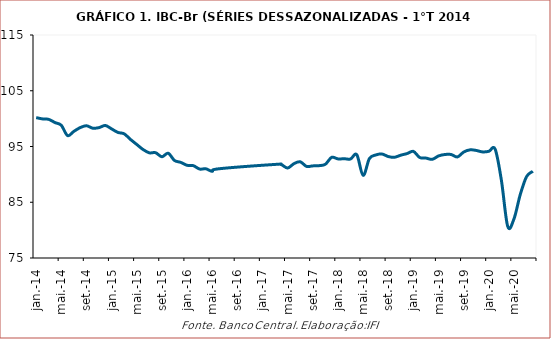
| Category | IBC-Br |
|---|---|
| 2014-01-01 | 100.182 |
| 2014-02-01 | 99.953 |
| 2014-03-01 | 99.865 |
| 2014-04-01 | 99.291 |
| 2014-05-01 | 98.804 |
| 2014-06-01 | 96.953 |
| 2014-07-01 | 97.717 |
| 2014-08-01 | 98.385 |
| 2014-09-01 | 98.723 |
| 2014-10-01 | 98.284 |
| 2014-11-01 | 98.385 |
| 2014-12-01 | 98.771 |
| 2015-01-01 | 98.156 |
| 2015-02-01 | 97.528 |
| 2015-03-01 | 97.278 |
| 2015-04-01 | 96.271 |
| 2015-05-01 | 95.366 |
| 2015-06-01 | 94.461 |
| 2015-07-01 | 93.866 |
| 2015-08-01 | 93.886 |
| 2015-09-01 | 93.157 |
| 2015-10-01 | 93.792 |
| 2015-11-01 | 92.495 |
| 2015-12-01 | 92.15 |
| 2016-01-01 | 91.63 |
| 2016-02-01 | 91.563 |
| 2016-03-01 | 90.955 |
| 2016-04-01 | 91.002 |
| 2016-05-01 | 90.549 |
| 2016-06-01 | 90.995 |
| 2017-03-01 | 91.785 |
| 2017-04-01 | 91.738 |
| 2017-05-01 | 91.137 |
| 2017-06-01 | 91.921 |
| 2017-07-01 | 92.258 |
| 2017-08-01 | 91.434 |
| 2017-09-01 | 91.522 |
| 2017-10-01 | 91.563 |
| 2017-11-01 | 91.812 |
| 2017-12-01 | 93.055 |
| 2018-01-01 | 92.772 |
| 2018-02-01 | 92.806 |
| 2018-03-01 | 92.758 |
| 2018-04-01 | 93.515 |
| 2018-05-01 | 89.82 |
| 2018-06-01 | 92.826 |
| 2018-07-01 | 93.474 |
| 2018-08-01 | 93.657 |
| 2018-09-01 | 93.197 |
| 2018-10-01 | 93.069 |
| 2018-11-01 | 93.447 |
| 2018-12-01 | 93.731 |
| 2019-01-01 | 94.123 |
| 2019-02-01 | 93.028 |
| 2019-03-01 | 92.92 |
| 2019-04-01 | 92.697 |
| 2019-05-01 | 93.305 |
| 2019-06-01 | 93.562 |
| 2019-07-01 | 93.562 |
| 2019-08-01 | 93.13 |
| 2019-09-01 | 94.008 |
| 2019-10-01 | 94.4 |
| 2019-11-01 | 94.292 |
| 2019-12-01 | 94.028 |
| 2020-01-01 | 94.136 |
| 2020-02-01 | 94.521 |
| 2020-03-01 | 88.914 |
| 2020-04-01 | 80.673 |
| 2020-05-01 | 82.031 |
| 2020-06-01 | 86.401 |
| 2020-07-01 | 89.603 |
| 2020-08-01 | 90.556 |